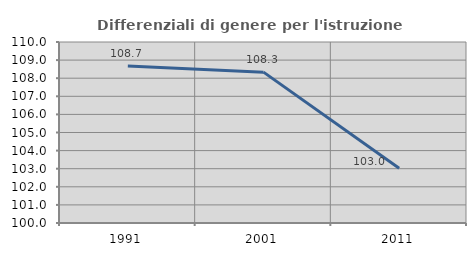
| Category | Differenziali di genere per l'istruzione superiore |
|---|---|
| 1991.0 | 108.668 |
| 2001.0 | 108.335 |
| 2011.0 | 103.026 |